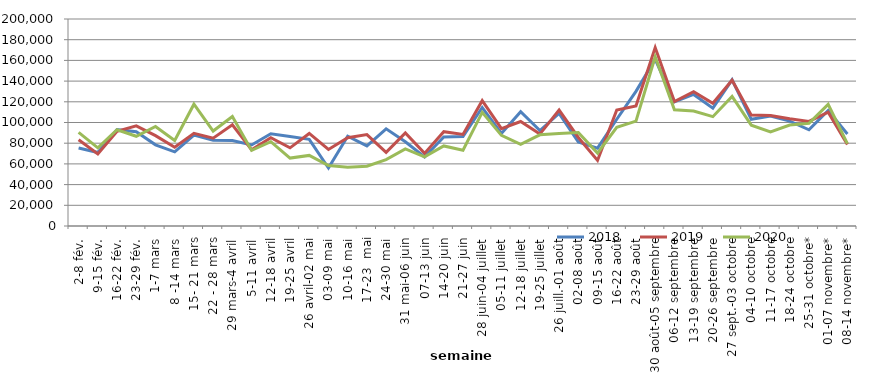
| Category | 2018 | 2019 | 2020 |
|---|---|---|---|
| 2-8 fév. | 75434 | 83347 | 90495 |
| 9-15 fév. | 71031 | 69559 | 75523 |
| 16-22 fév. | 93102 | 91428 | 93003 |
| 23-29 fév. | 91065 | 96774 | 86699 |
| 1-7 mars | 78415 | 87314 | 96119 |
| 8 -14 mars | 71697 | 76021 | 82690 |
| 15- 21 mars | 87845 | 89536 | 117673 |
| 22 - 28 mars | 82895 | 84912 | 91763.636 |
| 29 mars-4 avril | 82654 | 97699 | 105802 |
| 5-11 avril | 78244 | 73699 | 73060.606 |
| 12-18 avril | 89129 | 85348 | 81477 |
| 19-25 avril | 86398 | 75509 | 65653 |
| 26 avril-02 mai | 83743 | 89413 | 68188 |
| 03-09 mai | 56008 | 73891 | 58423 |
| 10-16 mai | 86722 | 85364 | 56762 |
| 17-23  mai | 77423 | 88345 | 57817 |
| 24-30 mai | 93888 | 71115 | 64117 |
| 31 mai-06 juin | 81416 | 89880 | 74412 |
| 07-13 juin | 66658 | 70150 | 66851 |
| 14-20 juin | 86057 | 91157 | 77340 |
| 21-27 juin | 86474 | 88454 | 73165 |
| 28 juin-04 juillet | 114502 | 121118 | 109774 |
| 05-11 juillet | 89389 | 94137 | 87596 |
| 12-18 juillet | 110384 | 100940 | 78915 |
| 19-25 juillet | 92231 | 88807 | 88097 |
| 26 juill.-01 août | 108699 | 112047 | 89418 |
| 02-08 août | 81067 | 85538 | 90304 |
| 09-15 août | 75229 | 63347 | 70433 |
| 16-22 août | 103158 | 111994 | 95333 |
| 23-29 août | 130053 | 116047 | 101359 |
| 30 août-05 septembre | 161020 | 172405 | 163439 |
| 06-12 septembre | 119903 | 120244 | 112241 |
| 13-19 septembre | 127142 | 129807 | 111025 |
| 20-26 septembre | 113803 | 118640 | 105627 |
| 27 sept.-03 octobre | 141252 | 140820 | 125188 |
| 04-10 octobre | 103071 | 107147 | 97408 |
| 11-17 octobre | 106226 | 106842 | 90810 |
| 18-24 octobre | 101349 | 103627 | 97529 |
| 25-31 octobre* | 92938 | 101052 | 99152 |
| 01-07 novembre* | 111647 | 109939 | 117511 |
| 08-14 novembre* | 88893 | 78757 | 79532 |